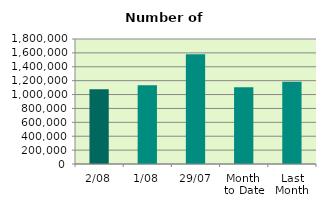
| Category | Series 0 |
|---|---|
| 2/08 | 1075150 |
| 1/08 | 1134180 |
| 29/07 | 1580130 |
| Month 
to Date | 1104665 |
| Last
Month | 1183989.81 |